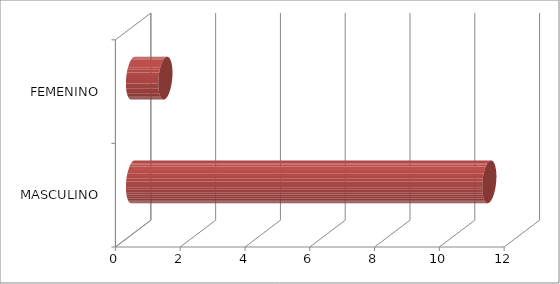
| Category | Series 0 |
|---|---|
| MASCULINO | 11 |
| FEMENINO | 1 |